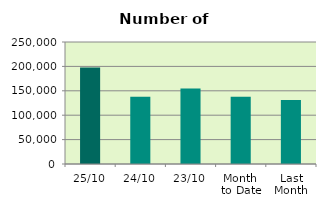
| Category | Series 0 |
|---|---|
| 25/10 | 197644 |
| 24/10 | 137552 |
| 23/10 | 154686 |
| Month 
to Date | 137575.053 |
| Last
Month | 130923.048 |